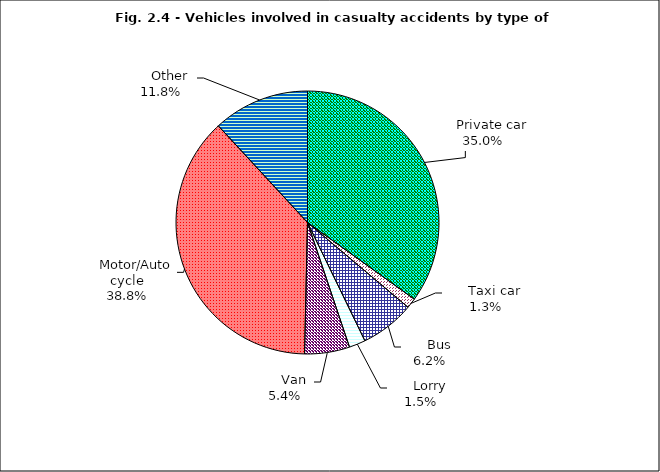
| Category | Series 0 |
|---|---|
|      Private car | 1578 |
|      Taxi car | 56 |
|      Bus | 301 |
|      Lorry | 91 |
|      Van | 250 |
|      Motor/Auto cycle | 1708 |
|      Other | 536 |